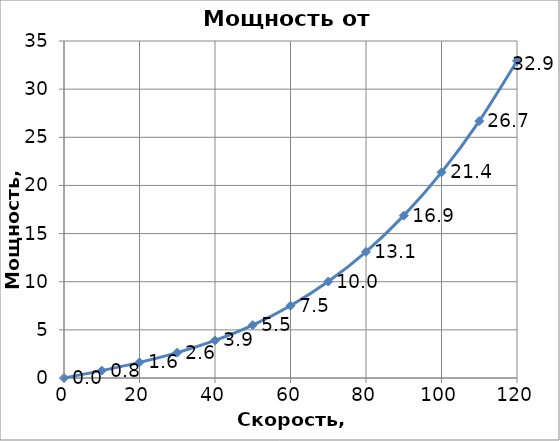
| Category | Мощность |
|---|---|
| 0.0 | 0 |
| 10.0 | 0.768 |
| 20.0 | 1.619 |
| 30.0 | 2.635 |
| 40.0 | 3.901 |
| 50.0 | 5.498 |
| 60.0 | 7.509 |
| 70.0 | 10.018 |
| 80.0 | 13.108 |
| 90.0 | 16.861 |
| 100.0 | 21.36 |
| 110.0 | 26.688 |
| 120.0 | 32.928 |